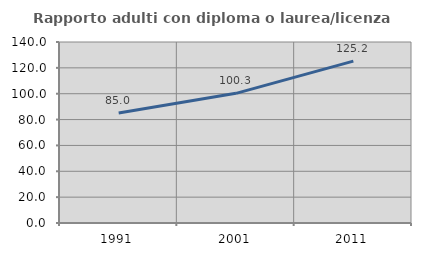
| Category | Rapporto adulti con diploma o laurea/licenza media  |
|---|---|
| 1991.0 | 85.019 |
| 2001.0 | 100.3 |
| 2011.0 | 125.176 |